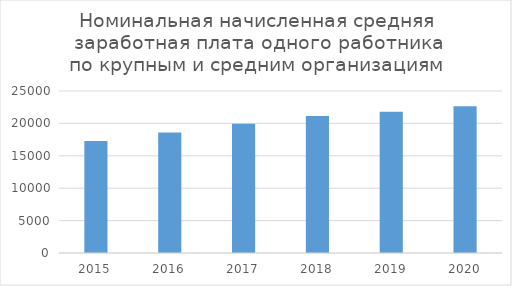
| Category | Номинальная начисленная средняя заработная плата одного работника по крупным и средним организациям |
|---|---|
| 2015.0 | 17267.9 |
| 2016.0 | 18589 |
| 2017.0 | 19960 |
| 2018.0 | 21158 |
| 2019.0 | 21790 |
| 2020.0 | 22660 |